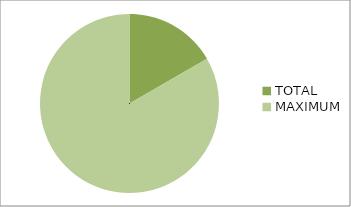
| Category | Series 0 |
|---|---|
| TOTAL | 40 |
| MAXIMUM | 200 |